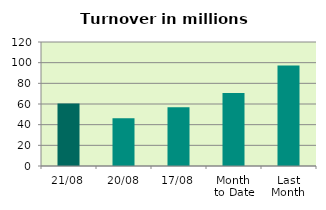
| Category | Series 0 |
|---|---|
| 21/08 | 60.433 |
| 20/08 | 46.228 |
| 17/08 | 56.747 |
| Month 
to Date | 70.76 |
| Last
Month | 97.283 |